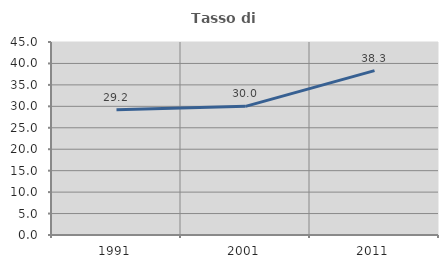
| Category | Tasso di occupazione   |
|---|---|
| 1991.0 | 29.197 |
| 2001.0 | 30 |
| 2011.0 | 38.326 |